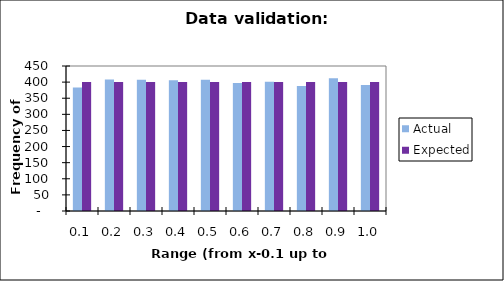
| Category | Actual | Expected |
|---|---|---|
| 0.1 | 383 | 400 |
| 0.2 | 408 | 400 |
| 0.30000000000000004 | 407 | 400 |
| 0.4 | 406 | 400 |
| 0.5 | 407 | 400 |
| 0.6 | 397 | 400 |
| 0.7 | 401 | 400 |
| 0.7999999999999999 | 388 | 400 |
| 0.8999999999999999 | 412 | 400 |
| 0.9999999999999999 | 391 | 400 |